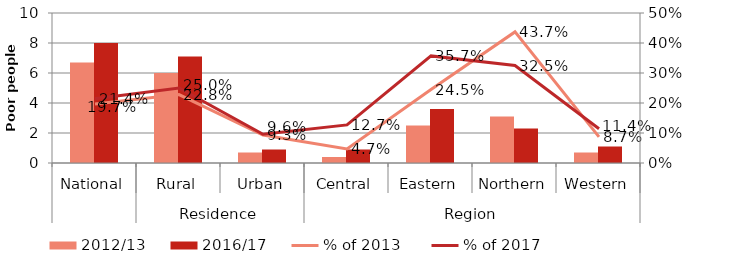
| Category | 2012/13 | 2016/17 |
|---|---|---|
| 0 | 6.7 | 8 |
| 1 | 6 | 7.1 |
| 2 | 0.7 | 0.9 |
| 3 | 0.4 | 0.9 |
| 4 | 2.5 | 3.6 |
| 5 | 3.1 | 2.3 |
| 6 | 0.7 | 1.1 |